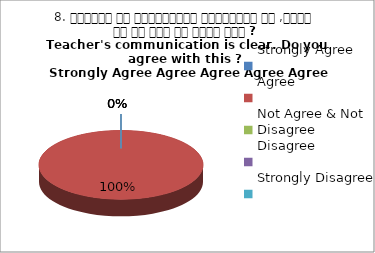
| Category | 8. शिक्षक का सम्प्रेषण सुस्पष्ठ है ,क्या आप इस बात से सहमत हैं ?
Teacher's communication is clear. Do you agree with this ? 
 Strongly Agree Agree Agree Agree Agree |
|---|---|
| Strongly Agree | 0 |
| Agree | 4 |
| Not Agree & Not Disagree | 0 |
| Disagree | 0 |
| Strongly Disagree | 0 |